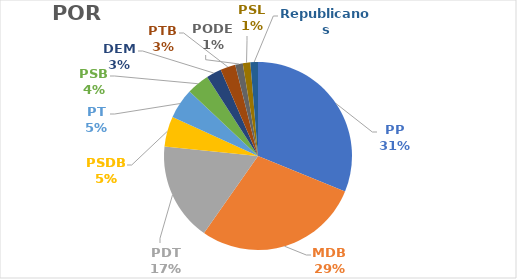
| Category | Series 0 |
|---|---|
| PP | 24 |
| MDB | 22 |
| PDT | 13 |
| PSDB | 4 |
| PT | 4 |
| PSB | 3 |
| DEM | 2 |
| PTB | 2 |
| PODE | 1 |
| PSL | 1 |
| Republicanos | 1 |